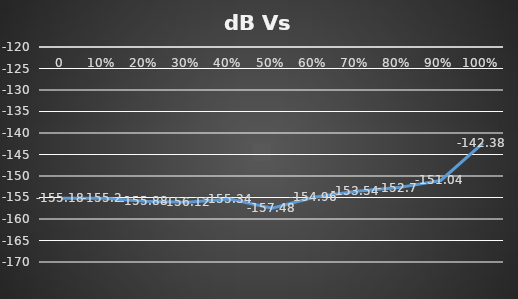
| Category | Series 0 |
|---|---|
| 0.0 | -155.18 |
| 0.1 | -155.2 |
| 0.2 | -155.88 |
| 0.3 | -156.12 |
| 0.4 | -155.34 |
| 0.5 | -157.48 |
| 0.6 | -154.96 |
| 0.7 | -153.54 |
| 0.8 | -152.7 |
| 0.9 | -151.04 |
| 1.0 | -142.38 |